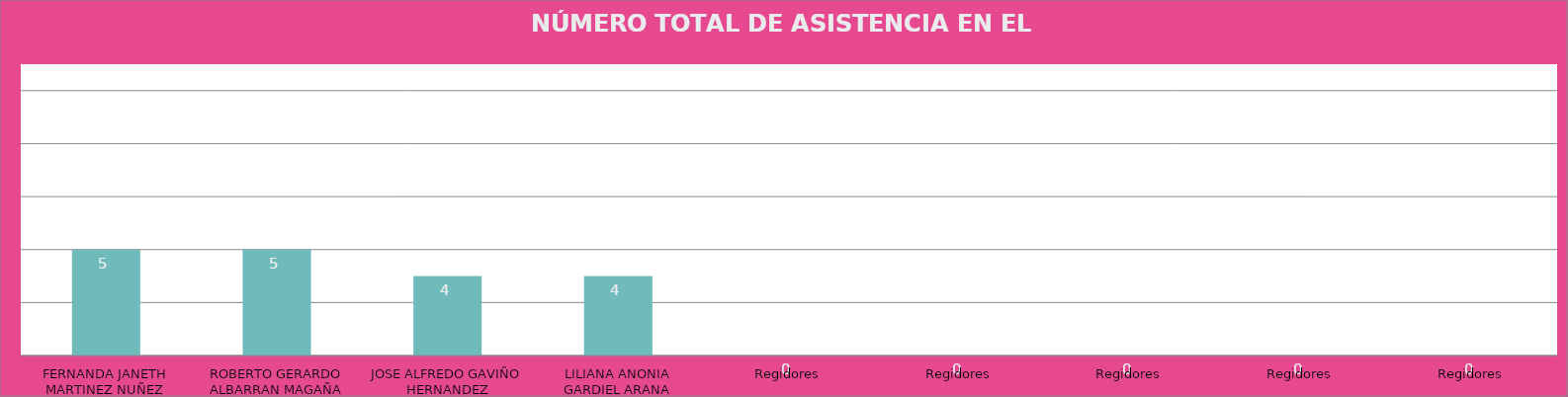
| Category | FERNANDA JANETH MARTINEZ NUÑEZ |
|---|---|
| FERNANDA JANETH MARTINEZ NUÑEZ | 5 |
| ROBERTO GERARDO ALBARRAN MAGAÑA | 5 |
| JOSE ALFREDO GAVIÑO HERNANDEZ | 4 |
| LILIANA ANONIA GARDIEL ARANA | 4 |
| Regidores | 0 |
| Regidores | 0 |
| Regidores | 0 |
| Regidores | 0 |
| Regidores | 0 |